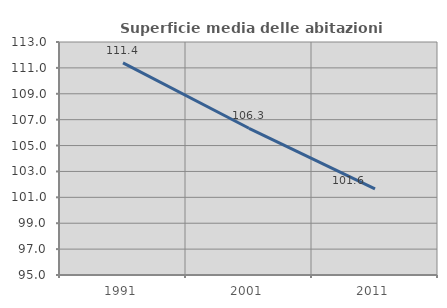
| Category | Superficie media delle abitazioni occupate |
|---|---|
| 1991.0 | 111.385 |
| 2001.0 | 106.335 |
| 2011.0 | 101.649 |